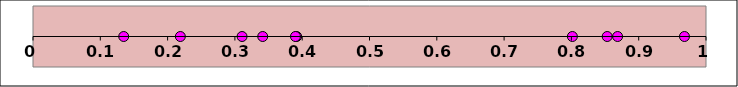
| Category | Series 1 |
|---|---|
| 0.8686302566686763 | 0 |
| 0.3106262614180574 | 0 |
| 0.39174504731763915 | 0 |
| 0.8531673335708344 | 0 |
| 0.3900014906515211 | 0 |
| 0.34134041367278156 | 0 |
| 0.9679958664610154 | 0 |
| 0.1347923032436359 | 0 |
| 0.801455280581433 | 0 |
| 0.2189485831809257 | 0 |